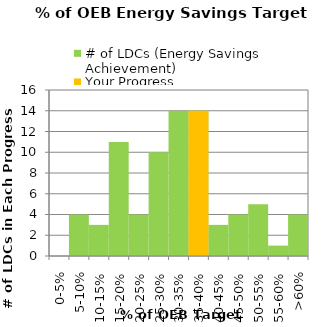
| Category | # of LDCs (Energy Savings Achievement) | Your Progress |
|---|---|---|
| 0-5% | 0 | 0 |
| 5-10% | 4 | 0 |
| 10-15% | 3 | 0 |
| 15-20% | 11 | 0 |
| 20-25% | 4 | 0 |
| 25-30% | 10 | 0 |
| 30-35% | 14 | 0 |
| 35-40% | 14 | 14 |
| 40-45% | 3 | 0 |
| 45-50% | 4 | 0 |
| 50-55% | 5 | 0 |
| 55-60% | 1 | 0 |
| >60% | 4 | 0 |